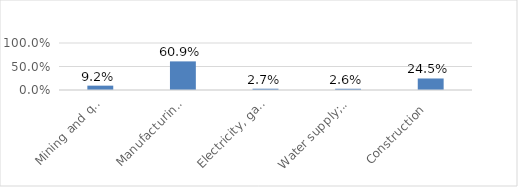
| Category |  Mining and quarrying   Manufacturing   Electricity, gas, steam and air condition   Water supply; sewerage, waste management   Construction  |
|---|---|
|  Mining and quarrying  | 0.092 |
|  Manufacturing  | 0.609 |
|  Electricity, gas, steam and air condition  | 0.027 |
|  Water supply; sewerage, waste management  | 0.026 |
|  Construction  | 0.245 |